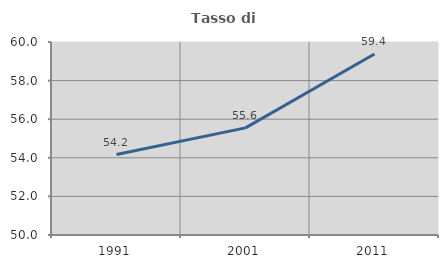
| Category | Tasso di occupazione   |
|---|---|
| 1991.0 | 54.171 |
| 2001.0 | 55.55 |
| 2011.0 | 59.381 |